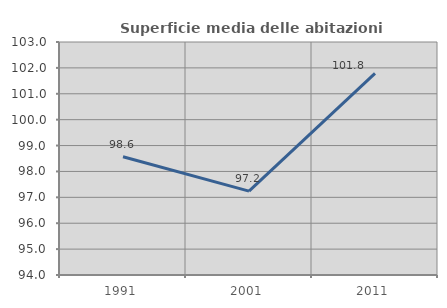
| Category | Superficie media delle abitazioni occupate |
|---|---|
| 1991.0 | 98.566 |
| 2001.0 | 97.238 |
| 2011.0 | 101.788 |